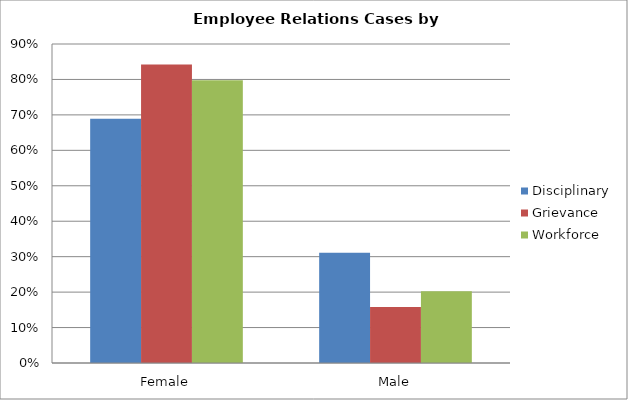
| Category | Disciplinary | Grievance | Workforce |
|---|---|---|---|
| Female | 0.689 | 0.842 | 0.798 |
| Male | 0.311 | 0.158 | 0.202 |